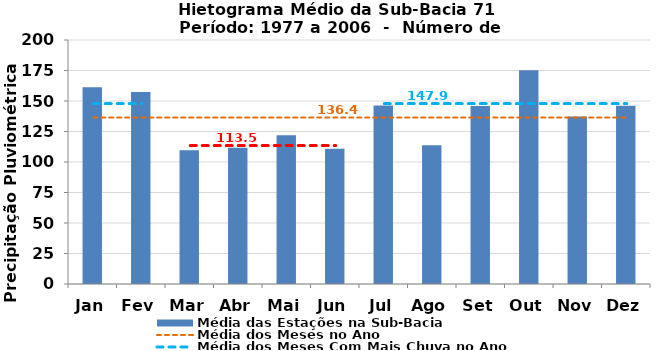
| Category | Média das Estações na Sub-Bacia |
|---|---|
| Jan | 161.279 |
| Fev | 157.401 |
| Mar | 109.714 |
| Abr | 111.684 |
| Mai | 121.86 |
| Jun | 110.797 |
| Jul | 146.257 |
| Ago | 113.664 |
| Set | 145.931 |
| Out | 175.124 |
| Nov | 137.207 |
| Dez | 146.084 |